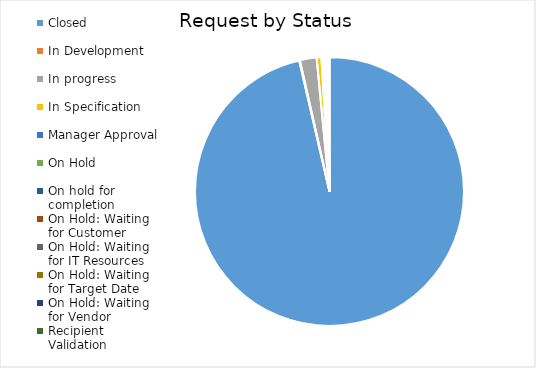
| Category | Series 0 |
|---|---|
| Closed  | 1199 |
| In Development  | 1 |
| In progress  | 25 |
| In Specification  | 7 |
| Manager Approval  | 1 |
| On Hold  | 3 |
| On hold for completion  | 1 |
| On Hold: Waiting for Customer  | 2 |
| On Hold: Waiting for IT Resources  | 3 |
| On Hold: Waiting for Target Date  | 1 |
| On Hold: Waiting for Vendor  | 1 |
| Recipient Validation  | 0 |